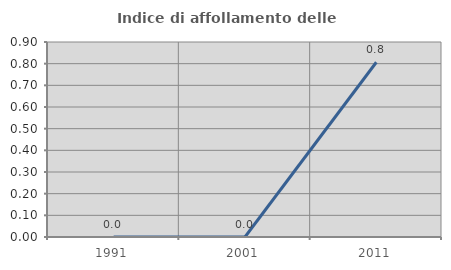
| Category | Indice di affollamento delle abitazioni  |
|---|---|
| 1991.0 | 0 |
| 2001.0 | 0 |
| 2011.0 | 0.806 |